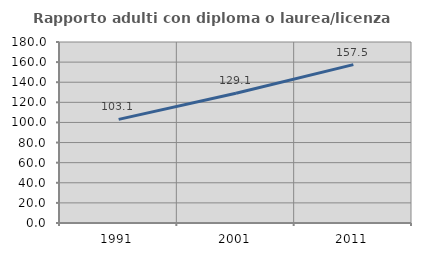
| Category | Rapporto adulti con diploma o laurea/licenza media  |
|---|---|
| 1991.0 | 103.053 |
| 2001.0 | 129.091 |
| 2011.0 | 157.485 |